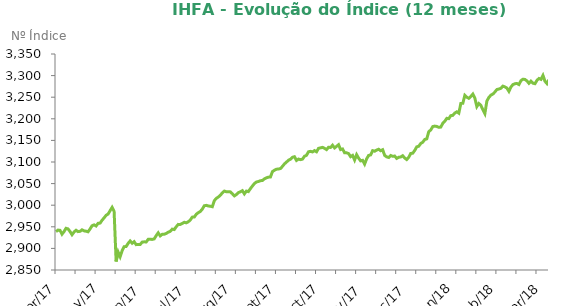
| Category | Series 0 |
|---|---|
| 2017-04-03 | 2938.74 |
| 2017-04-04 | 2942.46 |
| 2017-04-05 | 2941.82 |
| 2017-04-06 | 2932.9 |
| 2017-04-07 | 2938.84 |
| 2017-04-10 | 2946.51 |
| 2017-04-11 | 2945.12 |
| 2017-04-12 | 2939.13 |
| 2017-04-13 | 2931.7 |
| 2017-04-17 | 2937.95 |
| 2017-04-18 | 2941.96 |
| 2017-04-19 | 2938.86 |
| 2017-04-20 | 2939.51 |
| 2017-04-24 | 2943.08 |
| 2017-04-25 | 2940.62 |
| 2017-04-26 | 2939.82 |
| 2017-04-27 | 2938.48 |
| 2017-04-28 | 2945.05 |
| 2017-05-02 | 2952.51 |
| 2017-05-03 | 2954.44 |
| 2017-05-04 | 2951.86 |
| 2017-05-05 | 2958.06 |
| 2017-05-08 | 2958.53 |
| 2017-05-09 | 2965.23 |
| 2017-05-10 | 2970.63 |
| 2017-05-11 | 2976.69 |
| 2017-05-12 | 2979.47 |
| 2017-05-15 | 2987.37 |
| 2017-05-16 | 2995.06 |
| 2017-05-17 | 2985.5 |
| 2017-05-18 | 2869.7 |
| 2017-05-19 | 2891.59 |
| 2017-05-22 | 2880.83 |
| 2017-05-23 | 2894.76 |
| 2017-05-24 | 2903.95 |
| 2017-05-25 | 2904.34 |
| 2017-05-26 | 2911.74 |
| 2017-05-29 | 2917.24 |
| 2017-05-30 | 2911.96 |
| 2017-05-31 | 2915.58 |
| 2017-06-01 | 2908.72 |
| 2017-06-02 | 2909.02 |
| 2017-06-05 | 2908.96 |
| 2017-06-06 | 2914.61 |
| 2017-06-07 | 2915.21 |
| 2017-06-08 | 2914.8 |
| 2017-06-09 | 2921.03 |
| 2017-06-12 | 2921.21 |
| 2017-06-13 | 2920.77 |
| 2017-06-14 | 2921.99 |
| 2017-06-16 | 2929.56 |
| 2017-06-19 | 2936.05 |
| 2017-06-20 | 2928.95 |
| 2017-06-21 | 2932.59 |
| 2017-06-22 | 2932.74 |
| 2017-06-23 | 2934.6 |
| 2017-06-26 | 2937.53 |
| 2017-06-27 | 2939.41 |
| 2017-06-28 | 2944.58 |
| 2017-06-29 | 2943.62 |
| 2017-06-30 | 2950.16 |
| 2017-07-03 | 2955.6 |
| 2017-07-04 | 2955.56 |
| 2017-07-05 | 2957.73 |
| 2017-07-06 | 2960.53 |
| 2017-07-07 | 2959.17 |
| 2017-07-10 | 2961.57 |
| 2017-07-11 | 2965.8 |
| 2017-07-12 | 2972.4 |
| 2017-07-13 | 2972.53 |
| 2017-07-14 | 2979.01 |
| 2017-07-17 | 2982.73 |
| 2017-07-18 | 2985.4 |
| 2017-07-19 | 2990.95 |
| 2017-07-20 | 2998.74 |
| 2017-07-21 | 2999.62 |
| 2017-07-24 | 2998.28 |
| 2017-07-25 | 2997.56 |
| 2017-07-26 | 2996.42 |
| 2017-07-27 | 3010.5 |
| 2017-07-28 | 3015.89 |
| 2017-07-31 | 3018.91 |
| 2017-08-01 | 3023.15 |
| 2017-08-02 | 3028.5 |
| 2017-08-03 | 3032.62 |
| 2017-08-04 | 3031.1 |
| 2017-08-07 | 3030.9 |
| 2017-08-08 | 3030.85 |
| 2017-08-09 | 3026.58 |
| 2017-08-10 | 3021.59 |
| 2017-08-11 | 3024.69 |
| 2017-08-14 | 3029.04 |
| 2017-08-15 | 3031.14 |
| 2017-08-16 | 3033.62 |
| 2017-08-17 | 3026.19 |
| 2017-08-18 | 3032.71 |
| 2017-08-21 | 3031.49 |
| 2017-08-22 | 3038.28 |
| 2017-08-23 | 3044.37 |
| 2017-08-24 | 3050.08 |
| 2017-08-25 | 3053.71 |
| 2017-08-28 | 3054.88 |
| 2017-08-29 | 3056.68 |
| 2017-08-30 | 3057.22 |
| 2017-08-31 | 3060.96 |
| 2017-09-01 | 3063.36 |
| 2017-09-04 | 3064.89 |
| 2017-09-05 | 3065.3 |
| 2017-09-06 | 3077.87 |
| 2017-09-08 | 3080.91 |
| 2017-09-11 | 3083.37 |
| 2017-09-12 | 3083.7 |
| 2017-09-13 | 3084.82 |
| 2017-09-14 | 3089.87 |
| 2017-09-15 | 3095.68 |
| 2017-09-18 | 3099.68 |
| 2017-09-19 | 3104.11 |
| 2017-09-20 | 3106.43 |
| 2017-09-21 | 3110.87 |
| 2017-09-22 | 3112.23 |
| 2017-09-25 | 3103.56 |
| 2017-09-26 | 3106.82 |
| 2017-09-27 | 3105.4 |
| 2017-09-28 | 3106.68 |
| 2017-09-29 | 3113.35 |
| 2017-10-02 | 3115.51 |
| 2017-10-03 | 3123.73 |
| 2017-10-04 | 3124.65 |
| 2017-10-05 | 3123.31 |
| 2017-10-06 | 3126.44 |
| 2017-10-09 | 3123.64 |
| 2017-10-10 | 3131.59 |
| 2017-10-11 | 3132.76 |
| 2017-10-13 | 3133.85 |
| 2017-10-16 | 3131.7 |
| 2017-10-17 | 3128.73 |
| 2017-10-18 | 3134.21 |
| 2017-10-19 | 3133.57 |
| 2017-10-20 | 3138.87 |
| 2017-10-23 | 3132.56 |
| 2017-10-24 | 3136.24 |
| 2017-10-25 | 3140.07 |
| 2017-10-26 | 3128.75 |
| 2017-10-27 | 3130.14 |
| 2017-10-30 | 3121.42 |
| 2017-10-31 | 3121.27 |
| 2017-11-01 | 3119.52 |
| 2017-11-03 | 3112.33 |
| 2017-11-06 | 3115.26 |
| 2017-11-07 | 3104.62 |
| 2017-11-08 | 3116.99 |
| 2017-11-09 | 3108.9 |
| 2017-11-10 | 3102.58 |
| 2017-11-13 | 3103.84 |
| 2017-11-14 | 3095.13 |
| 2017-11-16 | 3107.22 |
| 2017-11-17 | 3115.17 |
| 2017-11-20 | 3116.49 |
| 2017-11-21 | 3126.26 |
| 2017-11-22 | 3124.96 |
| 2017-11-23 | 3127.6 |
| 2017-11-24 | 3129.52 |
| 2017-11-27 | 3126.12 |
| 2017-11-28 | 3128.45 |
| 2017-11-29 | 3115.32 |
| 2017-11-30 | 3111.86 |
| 2017-12-01 | 3110.48 |
| 2017-12-04 | 3115.05 |
| 2017-12-05 | 3113.11 |
| 2017-12-06 | 3113.79 |
| 2017-12-07 | 3108.29 |
| 2017-12-08 | 3110.94 |
| 2017-12-11 | 3111.59 |
| 2017-12-12 | 3114.54 |
| 2017-12-13 | 3109.29 |
| 2017-12-14 | 3105.72 |
| 2017-12-15 | 3110.9 |
| 2017-12-18 | 3119.71 |
| 2017-12-19 | 3120.39 |
| 2017-12-20 | 3126.67 |
| 2017-12-21 | 3135.04 |
| 2017-12-22 | 3136.49 |
| 2017-12-26 | 3142.86 |
| 2017-12-27 | 3145.84 |
| 2017-12-28 | 3152.16 |
| 2017-12-29 | 3153.5 |
| 2018-01-02 | 3170.15 |
| 2018-01-03 | 3174.19 |
| 2018-01-04 | 3182.03 |
| 2018-01-05 | 3183.06 |
| 2018-01-08 | 3182.29 |
| 2018-01-09 | 3180.25 |
| 2018-01-10 | 3180.83 |
| 2018-01-11 | 3189.52 |
| 2018-01-12 | 3194.23 |
| 2018-01-15 | 3201.07 |
| 2018-01-16 | 3200.35 |
| 2018-01-17 | 3207.32 |
| 2018-01-18 | 3208.02 |
| 2018-01-19 | 3213.38 |
| 2018-01-22 | 3216.1 |
| 2018-01-23 | 3213.02 |
| 2018-01-24 | 3235.46 |
| 2018-01-25 | 3235.9 |
| 2018-01-26 | 3254.25 |
| 2018-01-29 | 3249.85 |
| 2018-01-30 | 3247.44 |
| 2018-01-31 | 3251.9 |
| 2018-02-01 | 3257.2 |
| 2018-02-02 | 3247.85 |
| 2018-02-05 | 3228.32 |
| 2018-02-06 | 3235.4 |
| 2018-02-07 | 3231.06 |
| 2018-02-08 | 3221.02 |
| 2018-02-09 | 3212.06 |
| 2018-02-14 | 3241.17 |
| 2018-02-15 | 3249.43 |
| 2018-02-16 | 3254.74 |
| 2018-02-19 | 3257.39 |
| 2018-02-20 | 3262.06 |
| 2018-02-21 | 3267.78 |
| 2018-02-22 | 3268.88 |
| 2018-02-23 | 3270.63 |
| 2018-02-26 | 3275.64 |
| 2018-02-27 | 3273.84 |
| 2018-02-28 | 3271.09 |
| 2018-03-01 | 3263.6 |
| 2018-03-02 | 3273.55 |
| 2018-03-05 | 3279.17 |
| 2018-03-06 | 3281.16 |
| 2018-03-07 | 3281.81 |
| 2018-03-08 | 3279.36 |
| 2018-03-09 | 3288.21 |
| 2018-03-12 | 3291.69 |
| 2018-03-13 | 3291.07 |
| 2018-03-14 | 3287.69 |
| 2018-03-15 | 3282.12 |
| 2018-03-16 | 3287.18 |
| 2018-03-19 | 3282.48 |
| 2018-03-20 | 3281.26 |
| 2018-03-21 | 3289.12 |
| 2018-03-22 | 3293.36 |
| 2018-03-23 | 3291.23 |
| 2018-03-26 | 3300.31 |
| 2018-03-27 | 3286.92 |
| 2018-03-28 | 3281.5 |
| 2018-03-29 | 3290.85 |